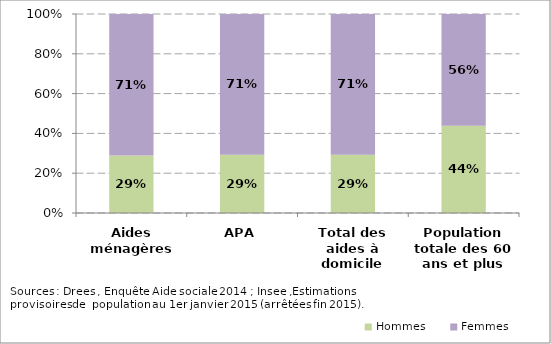
| Category | Hommes | Femmes |
|---|---|---|
| Aides ménagères | 0.289 | 0.711 |
| APA | 0.293 | 0.707 |
| Total des aides à domicile | 0.292 | 0.708 |
| Population totale des 60 ans et plus | 0.439 | 0.561 |